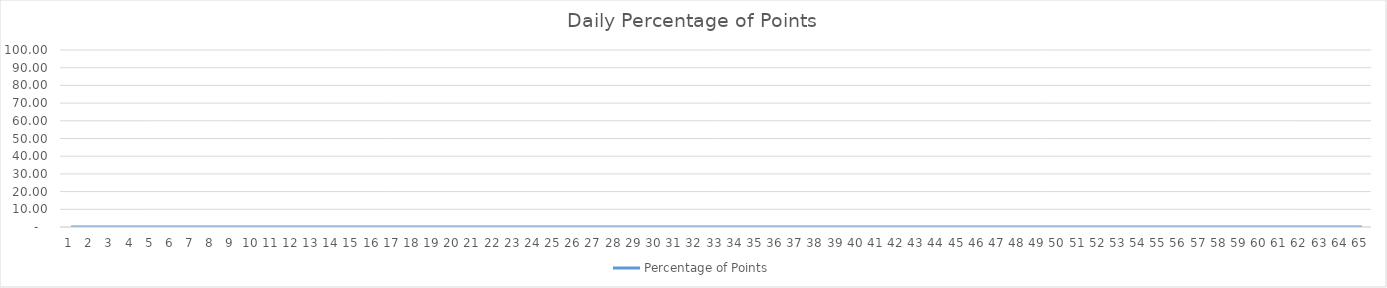
| Category | Percentage of Points |
|---|---|
| 0 | 0 |
| 1 | 0 |
| 2 | 0 |
| 3 | 0 |
| 4 | 0 |
| 5 | 0 |
| 6 | 0 |
| 7 | 0 |
| 8 | 0 |
| 9 | 0 |
| 10 | 0 |
| 11 | 0 |
| 12 | 0 |
| 13 | 0 |
| 14 | 0 |
| 15 | 0 |
| 16 | 0 |
| 17 | 0 |
| 18 | 0 |
| 19 | 0 |
| 20 | 0 |
| 21 | 0 |
| 22 | 0 |
| 23 | 0 |
| 24 | 0 |
| 25 | 0 |
| 26 | 0 |
| 27 | 0 |
| 28 | 0 |
| 29 | 0 |
| 30 | 0 |
| 31 | 0 |
| 32 | 0 |
| 33 | 0 |
| 34 | 0 |
| 35 | 0 |
| 36 | 0 |
| 37 | 0 |
| 38 | 0 |
| 39 | 0 |
| 40 | 0 |
| 41 | 0 |
| 42 | 0 |
| 43 | 0 |
| 44 | 0 |
| 45 | 0 |
| 46 | 0 |
| 47 | 0 |
| 48 | 0 |
| 49 | 0 |
| 50 | 0 |
| 51 | 0 |
| 52 | 0 |
| 53 | 0 |
| 54 | 0 |
| 55 | 0 |
| 56 | 0 |
| 57 | 0 |
| 58 | 0 |
| 59 | 0 |
| 60 | 0 |
| 61 | 0 |
| 62 | 0 |
| 63 | 0 |
| 64 | 0 |